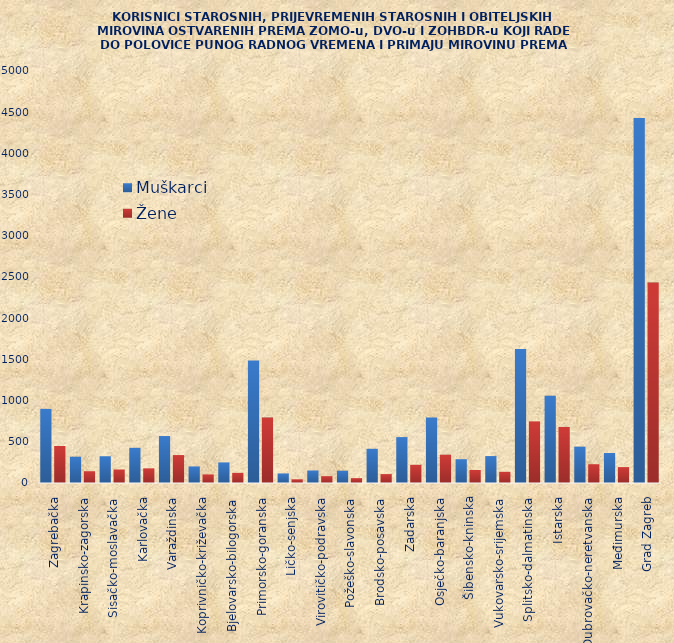
| Category | Muškarci | Žene |
|---|---|---|
| Zagrebačka | 900 | 449 |
| Krapinsko-zagorska | 319 | 143 |
| Sisačko-moslavačka | 325 | 164 |
| Karlovačka | 427 | 178 |
| Varaždinska | 570 | 339 |
| Koprivničko-križevačka | 201 | 104 |
| Bjelovarsko-bilogorska | 250 | 123 |
| Primorsko-goranska | 1487 | 794 |
| Ličko-senjska | 116 | 45 |
| Virovitičko-podravska | 152 | 83 |
| Požeško-slavonska | 149 | 59 |
| Brodsko-posavska | 415 | 108 |
| Zadarska | 557 | 221 |
| Osječko-baranjska | 796 | 343 |
| Šibensko-kninska | 289 | 158 |
| Vukovarsko-srijemska | 327 | 136 |
| Splitsko-dalmatinska | 1627 | 748 |
| Istarska | 1058 | 680 |
| Dubrovačko-neretvanska | 441 | 228 |
| Međimurska | 364 | 193 |
| Grad Zagreb | 4429 | 2433 |